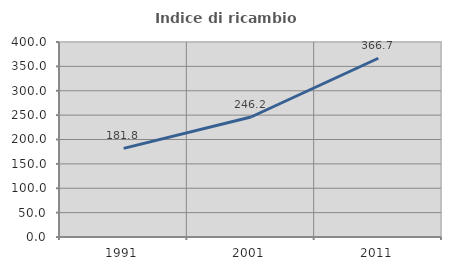
| Category | Indice di ricambio occupazionale  |
|---|---|
| 1991.0 | 181.818 |
| 2001.0 | 246.154 |
| 2011.0 | 366.667 |